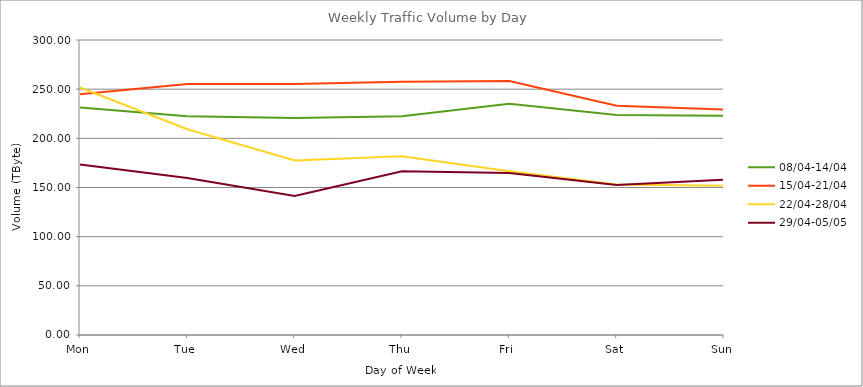
| Category | 08/04-14/04 | 15/04-21/04 | 22/04-28/04 | 29/04-05/05 |
|---|---|---|---|---|
| Mon | 231.33 | 244.8 | 251.73 | 173.3 |
| Tue | 222.35 | 255.33 | 209.24 | 159.69 |
| Wed | 220.78 | 255.3 | 177.41 | 141.38 |
| Thu | 222.58 | 257.5 | 181.83 | 166.43 |
| Fri | 235.04 | 258.21 | 166.6 | 164.65 |
| Sat | 223.76 | 233.09 | 153.1 | 152.47 |
| Sun | 222.93 | 229.34 | 151.8 | 157.9 |